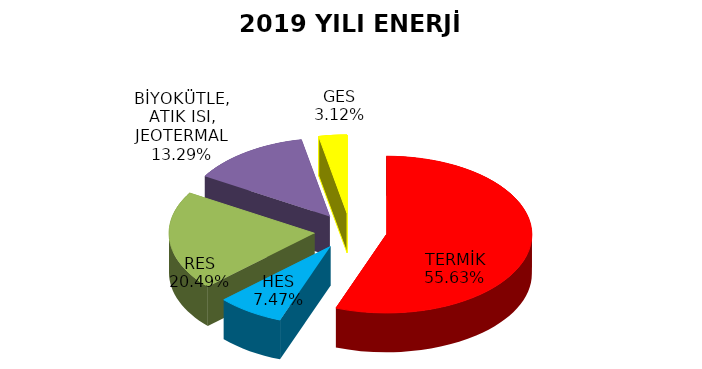
| Category | Series 0 |
|---|---|
| TERMİK | 1569.406 |
| HES | 210.596 |
| RES | 578.02 |
| BİYOKÜTLE, ATIK ISI, JEOTERMAL | 375.003 |
| GES | 88.037 |